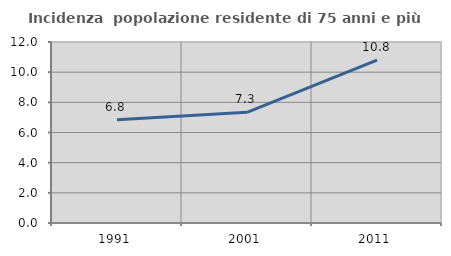
| Category | Incidenza  popolazione residente di 75 anni e più |
|---|---|
| 1991.0 | 6.849 |
| 2001.0 | 7.339 |
| 2011.0 | 10.8 |